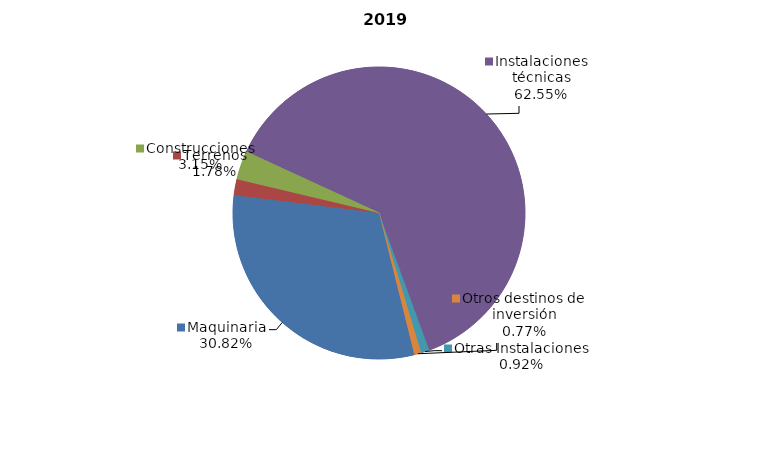
| Category | 2019 |
|---|---|
| Maquinaria | 144693152.13 |
| Terrenos | 8379964 |
| Construcciones | 14810530 |
| Instalaciones técnicas | 293676083.02 |
| Otras Instalaciones | 4299615 |
| Otros destinos de inversión | 3632379 |